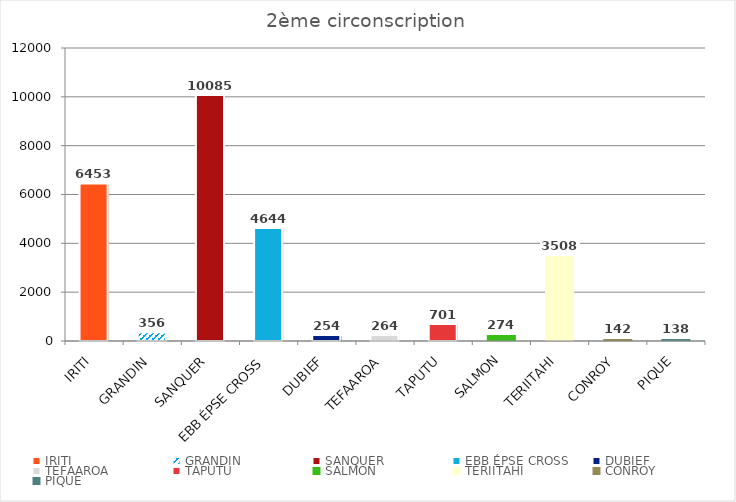
| Category | Series 0 |
|---|---|
| IRITI | 6453 |
| GRANDIN | 356 |
| SANQUER | 10085 |
| EBB ÉPSE CROSS | 4644 |
| DUBIEF | 254 |
| TEFAAROA | 264 |
| TAPUTU | 701 |
| SALMON | 274 |
| TERIITAHI | 3508 |
| CONROY | 142 |
| PIQUE | 138 |